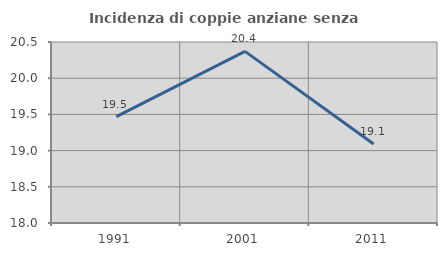
| Category | Incidenza di coppie anziane senza figli  |
|---|---|
| 1991.0 | 19.469 |
| 2001.0 | 20.37 |
| 2011.0 | 19.091 |